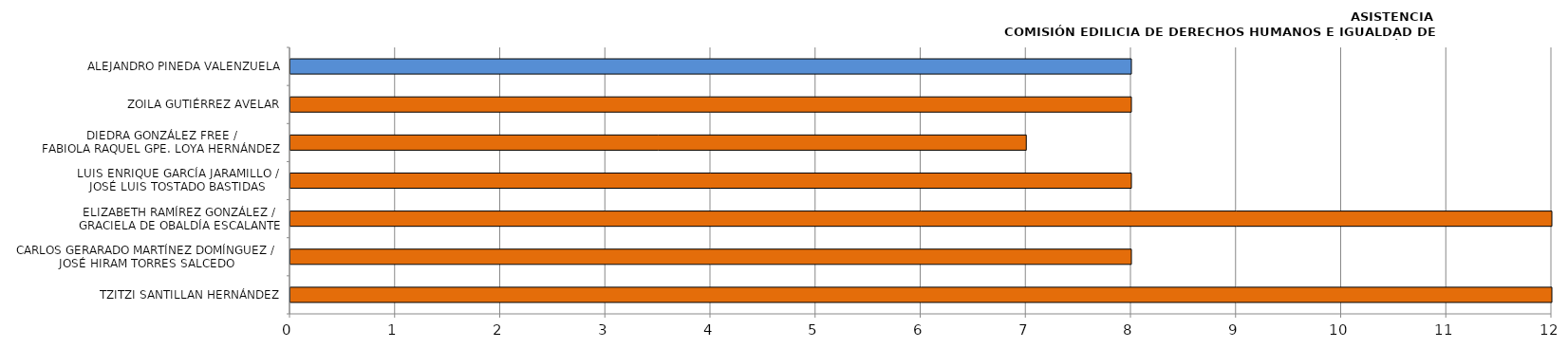
| Category | Series 0 |
|---|---|
| TZITZI SANTILLAN HERNÁNDEZ | 12 |
| CARLOS GERARADO MARTÍNEZ DOMÍNGUEZ /
JOSÉ HIRAM TORRES SALCEDO | 8 |
| ELIZABETH RAMÍREZ GONZÁLEZ /
GRACIELA DE OBALDÍA ESCALANTE | 12 |
| LUIS ENRIQUE GARCÍA JARAMILLO /
JOSÉ LUIS TOSTADO BASTIDAS | 8 |
| DIEDRA GONZÁLEZ FREE /
FABIOLA RAQUEL GPE. LOYA HERNÁNDEZ | 7 |
| ZOILA GUTIÉRREZ AVELAR | 8 |
| ALEJANDRO PINEDA VALENZUELA | 8 |